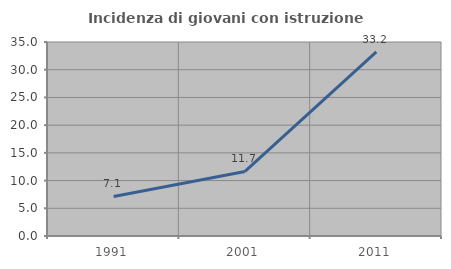
| Category | Incidenza di giovani con istruzione universitaria |
|---|---|
| 1991.0 | 7.143 |
| 2001.0 | 11.653 |
| 2011.0 | 33.234 |